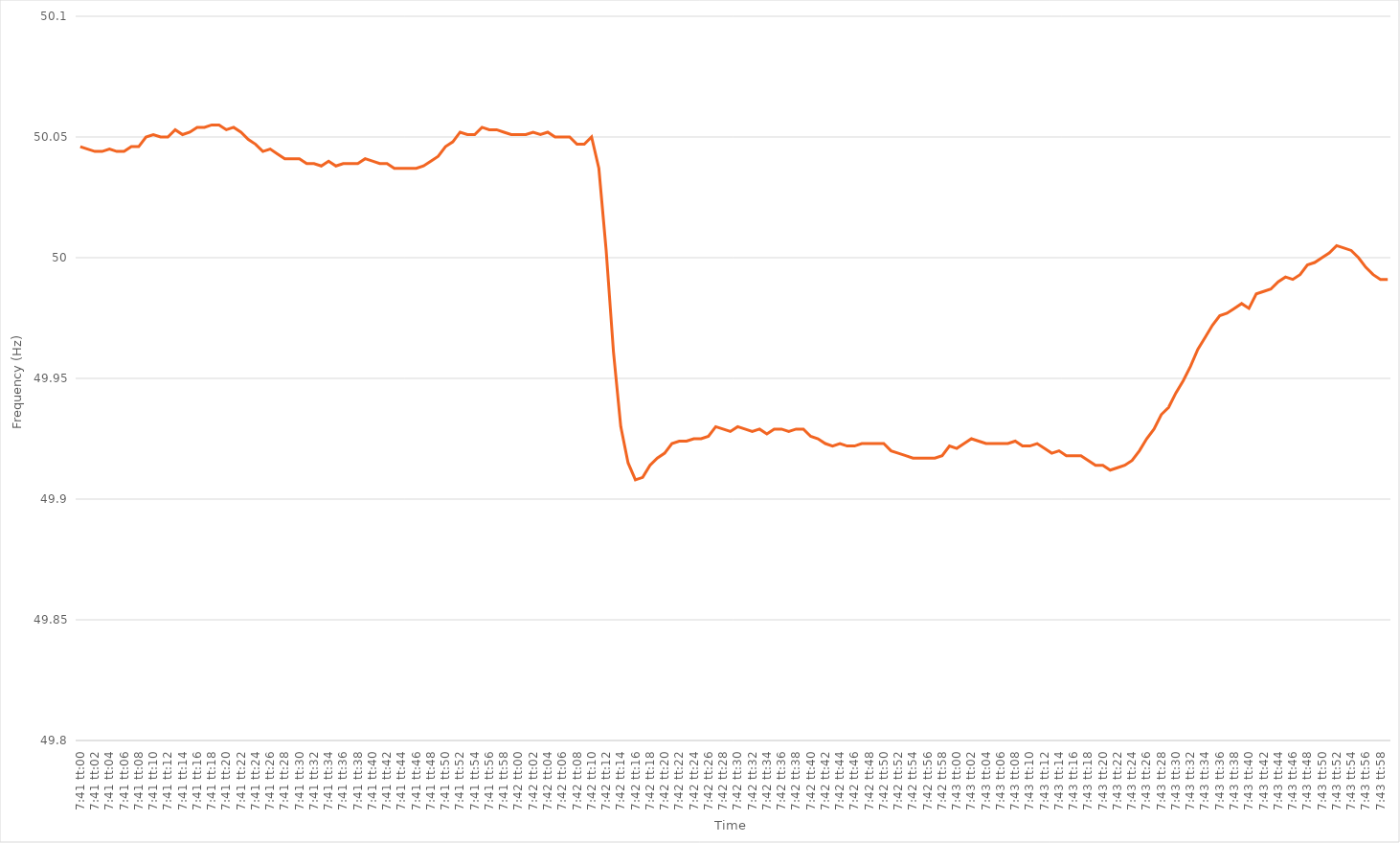
| Category | Series 0 |
|---|---|
| 0.3201388888888889 | 50.046 |
| 0.32015046296296296 | 50.045 |
| 0.32016203703703705 | 50.044 |
| 0.3201736111111111 | 50.044 |
| 0.3201851851851852 | 50.045 |
| 0.3201967592592592 | 50.044 |
| 0.3202083333333334 | 50.044 |
| 0.3202199074074074 | 50.046 |
| 0.32023148148148145 | 50.046 |
| 0.32024305555555554 | 50.05 |
| 0.32025462962962964 | 50.051 |
| 0.3202662037037037 | 50.05 |
| 0.3202777777777778 | 50.05 |
| 0.32028935185185187 | 50.053 |
| 0.3203009259259259 | 50.051 |
| 0.3203125 | 50.052 |
| 0.3203240740740741 | 50.054 |
| 0.32033564814814813 | 50.054 |
| 0.3203472222222222 | 50.055 |
| 0.3203587962962963 | 50.055 |
| 0.32037037037037036 | 50.053 |
| 0.32038194444444446 | 50.054 |
| 0.32039351851851855 | 50.052 |
| 0.3204050925925926 | 50.049 |
| 0.3204166666666666 | 50.047 |
| 0.3204282407407408 | 50.044 |
| 0.3204398148148148 | 50.045 |
| 0.3204513888888889 | 50.043 |
| 0.32046296296296295 | 50.041 |
| 0.32047453703703704 | 50.041 |
| 0.3204861111111111 | 50.041 |
| 0.3204976851851852 | 50.039 |
| 0.32050925925925927 | 50.039 |
| 0.3205208333333333 | 50.038 |
| 0.3205324074074074 | 50.04 |
| 0.3205439814814815 | 50.038 |
| 0.32055555555555554 | 50.039 |
| 0.32056712962962963 | 50.039 |
| 0.3205787037037037 | 50.039 |
| 0.32059027777777777 | 50.041 |
| 0.32060185185185186 | 50.04 |
| 0.32061342592592595 | 50.039 |
| 0.320625 | 50.039 |
| 0.3206365740740741 | 50.037 |
| 0.3206481481481482 | 50.037 |
| 0.3206597222222222 | 50.037 |
| 0.3206712962962963 | 50.037 |
| 0.32068287037037035 | 50.038 |
| 0.32069444444444445 | 50.04 |
| 0.3207060185185185 | 50.042 |
| 0.3207175925925926 | 50.046 |
| 0.3207291666666667 | 50.048 |
| 0.3207407407407407 | 50.052 |
| 0.3207523148148148 | 50.051 |
| 0.3207638888888889 | 50.051 |
| 0.32077546296296294 | 50.054 |
| 0.32078703703703704 | 50.053 |
| 0.32079861111111113 | 50.053 |
| 0.32081018518518517 | 50.052 |
| 0.32082175925925926 | 50.051 |
| 0.32083333333333336 | 50.051 |
| 0.3208449074074074 | 50.051 |
| 0.3208564814814815 | 50.052 |
| 0.3208680555555556 | 50.051 |
| 0.3208796296296296 | 50.052 |
| 0.3208912037037037 | 50.05 |
| 0.32090277777777776 | 50.05 |
| 0.32091435185185185 | 50.05 |
| 0.3209259259259259 | 50.047 |
| 0.3209375 | 50.047 |
| 0.3209490740740741 | 50.05 |
| 0.3209606481481481 | 50.037 |
| 0.3209722222222222 | 50.003 |
| 0.3209837962962963 | 49.961 |
| 0.32099537037037035 | 49.93 |
| 0.32100694444444444 | 49.915 |
| 0.32101851851851854 | 49.908 |
| 0.3210300925925926 | 49.909 |
| 0.32104166666666667 | 49.914 |
| 0.32105324074074076 | 49.917 |
| 0.3210648148148148 | 49.919 |
| 0.3210763888888889 | 49.923 |
| 0.321087962962963 | 49.924 |
| 0.32109953703703703 | 49.924 |
| 0.3211111111111111 | 49.925 |
| 0.32112268518518516 | 49.925 |
| 0.32113425925925926 | 49.926 |
| 0.3211458333333333 | 49.93 |
| 0.32115740740740745 | 49.929 |
| 0.3211689814814815 | 49.928 |
| 0.3211805555555555 | 49.93 |
| 0.3211921296296296 | 49.929 |
| 0.3212037037037037 | 49.928 |
| 0.32121527777777775 | 49.929 |
| 0.32122685185185185 | 49.927 |
| 0.32123842592592594 | 49.929 |
| 0.32125 | 49.929 |
| 0.3212615740740741 | 49.928 |
| 0.32127314814814817 | 49.929 |
| 0.3212847222222222 | 49.929 |
| 0.3212962962962963 | 49.926 |
| 0.3213078703703704 | 49.925 |
| 0.32131944444444444 | 49.923 |
| 0.32133101851851853 | 49.922 |
| 0.3213425925925926 | 49.923 |
| 0.32135416666666666 | 49.922 |
| 0.3213657407407407 | 49.922 |
| 0.32137731481481485 | 49.923 |
| 0.3213888888888889 | 49.923 |
| 0.321400462962963 | 49.923 |
| 0.321412037037037 | 49.923 |
| 0.3214236111111111 | 49.92 |
| 0.32143518518518516 | 49.919 |
| 0.32144675925925925 | 49.918 |
| 0.32145833333333335 | 49.917 |
| 0.3214699074074074 | 49.917 |
| 0.3214814814814815 | 49.917 |
| 0.3214930555555556 | 49.917 |
| 0.3215046296296296 | 49.918 |
| 0.3215162037037037 | 49.922 |
| 0.3215277777777778 | 49.921 |
| 0.32153935185185184 | 49.923 |
| 0.32155092592592593 | 49.925 |
| 0.32156250000000003 | 49.924 |
| 0.32157407407407407 | 49.923 |
| 0.32158564814814816 | 49.923 |
| 0.32159722222222226 | 49.923 |
| 0.3216087962962963 | 49.923 |
| 0.3216203703703704 | 49.924 |
| 0.32163194444444443 | 49.922 |
| 0.3216435185185185 | 49.922 |
| 0.32165509259259256 | 49.923 |
| 0.32166666666666666 | 49.921 |
| 0.32167824074074075 | 49.919 |
| 0.3216898148148148 | 49.92 |
| 0.3217013888888889 | 49.918 |
| 0.321712962962963 | 49.918 |
| 0.321724537037037 | 49.918 |
| 0.3217361111111111 | 49.916 |
| 0.3217476851851852 | 49.914 |
| 0.32175925925925924 | 49.914 |
| 0.32177083333333334 | 49.912 |
| 0.32178240740740743 | 49.913 |
| 0.3217939814814815 | 49.914 |
| 0.32180555555555557 | 49.916 |
| 0.32181712962962966 | 49.92 |
| 0.3218287037037037 | 49.925 |
| 0.3218402777777778 | 49.929 |
| 0.32185185185185183 | 49.935 |
| 0.32186342592592593 | 49.938 |
| 0.32187499999999997 | 49.944 |
| 0.32188657407407406 | 49.949 |
| 0.32189814814814816 | 49.955 |
| 0.3219097222222222 | 49.962 |
| 0.3219212962962963 | 49.967 |
| 0.3219328703703704 | 49.972 |
| 0.3219444444444444 | 49.976 |
| 0.3219560185185185 | 49.977 |
| 0.3219675925925926 | 49.979 |
| 0.32197916666666665 | 49.981 |
| 0.32199074074074074 | 49.979 |
| 0.32200231481481484 | 49.985 |
| 0.3220138888888889 | 49.986 |
| 0.32202546296296297 | 49.987 |
| 0.32203703703703707 | 49.99 |
| 0.3220486111111111 | 49.992 |
| 0.3220601851851852 | 49.991 |
| 0.32207175925925924 | 49.993 |
| 0.32208333333333333 | 49.997 |
| 0.32209490740740737 | 49.998 |
| 0.3221064814814815 | 50 |
| 0.32211805555555556 | 50.002 |
| 0.3221296296296296 | 50.005 |
| 0.3221412037037037 | 50.004 |
| 0.3221527777777778 | 50.003 |
| 0.3221643518518518 | 50 |
| 0.3221759259259259 | 49.996 |
| 0.3221875 | 49.993 |
| 0.32219907407407405 | 49.991 |
| 0.32221064814814815 | 49.991 |